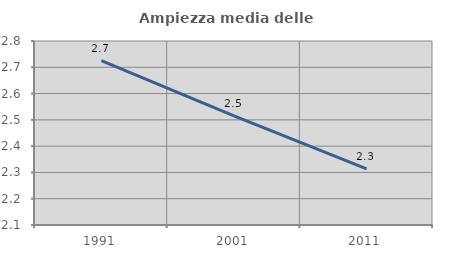
| Category | Ampiezza media delle famiglie |
|---|---|
| 1991.0 | 2.725 |
| 2001.0 | 2.516 |
| 2011.0 | 2.313 |